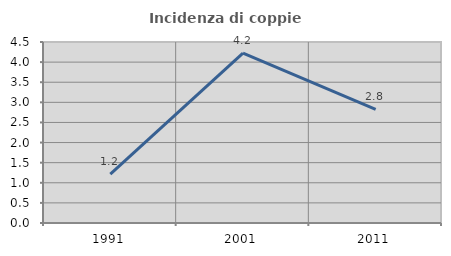
| Category | Incidenza di coppie miste |
|---|---|
| 1991.0 | 1.215 |
| 2001.0 | 4.225 |
| 2011.0 | 2.825 |